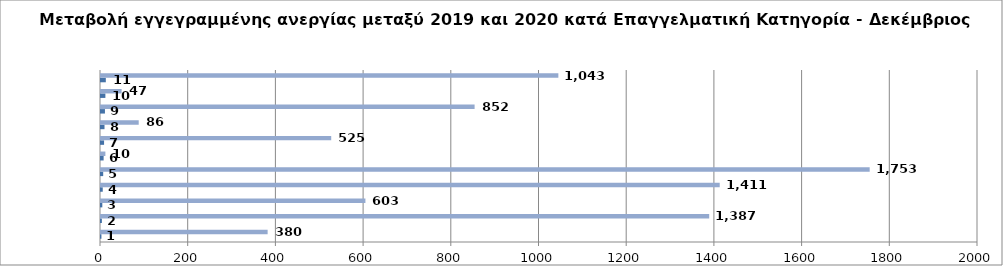
| Category | Series 0 | Series 1 |
|---|---|---|
| 0 | 1 | 380 |
| 1 | 2 | 1387 |
| 2 | 3 | 603 |
| 3 | 4 | 1411 |
| 4 | 5 | 1753 |
| 5 | 6 | 10 |
| 6 | 7 | 525 |
| 7 | 8 | 86 |
| 8 | 9 | 852 |
| 9 | 10 | 47 |
| 10 | 11 | 1043 |